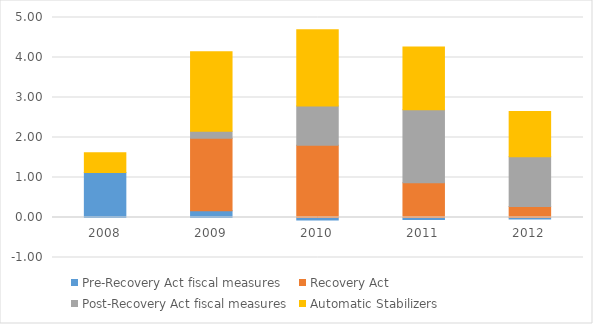
| Category | Pre-Recovery Act fiscal measures | Recovery Act | Post-Recovery Act fiscal measures | Automatic Stabilizers |
|---|---|---|---|---|
| 2008.0 | 1.125 | 0 | 0 | 0.49 |
| 2009.0 | 0.168 | 1.813 | 0.176 | 1.986 |
| 2010.0 | -0.06 | 1.807 | 0.981 | 1.907 |
| 2011.0 | -0.047 | 0.868 | 1.826 | 1.569 |
| 2012.0 | -0.038 | 0.275 | 1.241 | 1.136 |